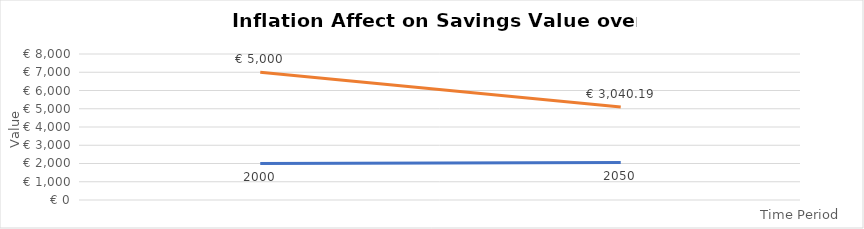
| Category | Series 0 | Series 1 |
|---|---|---|
| 0 | 2000 | 5000 |
| 1 | 2050 | 3040.194 |